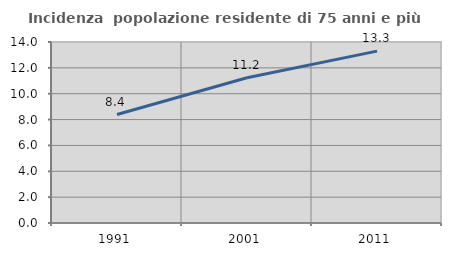
| Category | Incidenza  popolazione residente di 75 anni e più |
|---|---|
| 1991.0 | 8.392 |
| 2001.0 | 11.235 |
| 2011.0 | 13.293 |